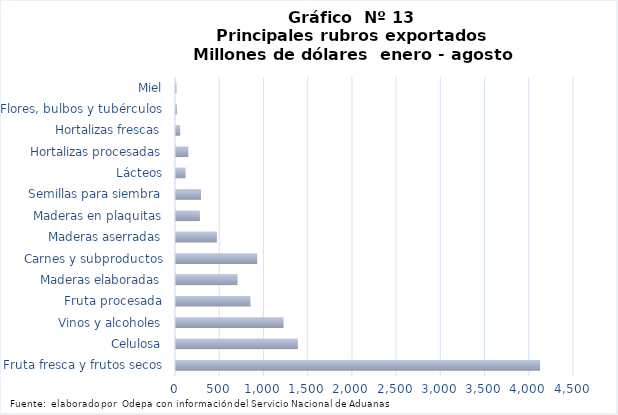
| Category | Series 7 |
|---|---|
| Fruta fresca y frutos secos | 4116604.475 |
| Celulosa | 1377621.453 |
| Vinos y alcoholes | 1215476.93 |
| Fruta procesada | 842043.46 |
| Maderas elaboradas | 696295.697 |
| Carnes y subproductos | 918177.771 |
| Maderas aserradas | 462807.719 |
| Maderas en plaquitas | 270116.99 |
| Semillas para siembra | 282633.754 |
| Lácteos | 108519.178 |
| Hortalizas procesadas | 139479.338 |
| Hortalizas frescas | 47057.822 |
| Flores, bulbos y tubérculos | 9238.698 |
| Miel | 5482.708 |